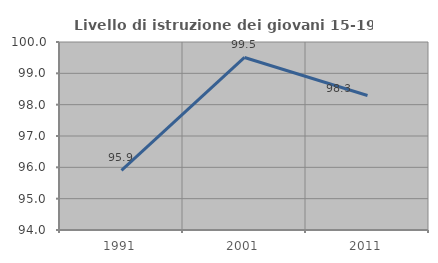
| Category | Livello di istruzione dei giovani 15-19 anni |
|---|---|
| 1991.0 | 95.906 |
| 2001.0 | 99.506 |
| 2011.0 | 98.294 |